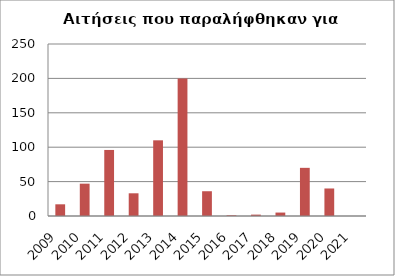
| Category | Series 1 |
|---|---|
| 2009.0 | 17 |
| 2010.0 | 47 |
| 2011.0 | 96 |
| 2012.0 | 33 |
| 2013.0 | 110 |
| 2014.0 | 200 |
| 2015.0 | 36 |
| 2016.0 | 1 |
| 2017.0 | 2 |
| 2018.0 | 5 |
| 2019.0 | 70 |
| 2020.0 | 40 |
| 2021.0 | 0 |